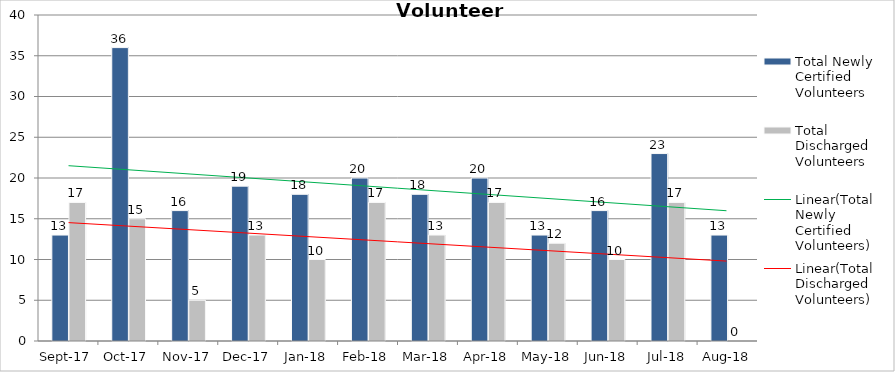
| Category | Total Newly Certified Volunteers | Total Discharged Volunteers |
|---|---|---|
| 2017-09-01 | 13 | 17 |
| 2017-10-01 | 36 | 15 |
| 2017-11-01 | 16 | 5 |
| 2017-12-01 | 19 | 13 |
| 2018-01-01 | 18 | 10 |
| 2018-02-01 | 20 | 17 |
| 2018-03-01 | 18 | 13 |
| 2018-04-01 | 20 | 17 |
| 2018-05-01 | 13 | 12 |
| 2018-06-01 | 16 | 10 |
| 2018-07-01 | 23 | 17 |
| 2018-08-01 | 13 | 0 |